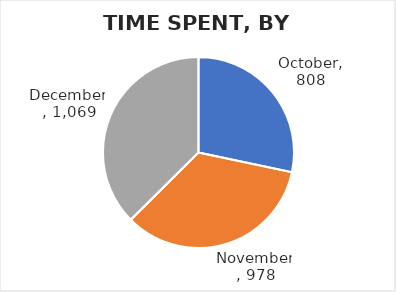
| Category | Total minutes |
|---|---|
| October | 808 |
| November | 978 |
| December | 1069 |